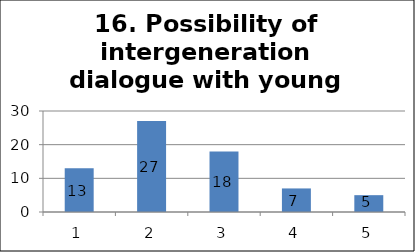
| Category | Series 1 |
|---|---|
| 0 | 13 |
| 1 | 27 |
| 2 | 18 |
| 3 | 7 |
| 4 | 5 |